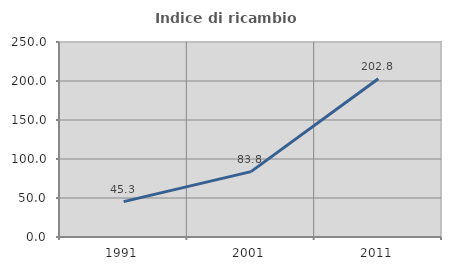
| Category | Indice di ricambio occupazionale  |
|---|---|
| 1991.0 | 45.329 |
| 2001.0 | 83.77 |
| 2011.0 | 202.796 |